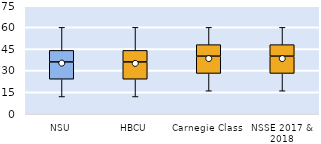
| Category | 25th | 50th | 75th |
|---|---|---|---|
| NSU | 24 | 12 | 8 |
| HBCU | 24 | 12 | 8 |
| Carnegie Class | 28 | 12 | 8 |
| NSSE 2017 & 2018 | 28 | 12 | 8 |